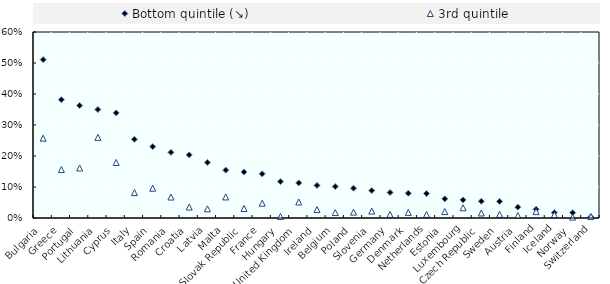
| Category | Bottom quintile (↘) | 3rd quintile |
|---|---|---|
| Bulgaria | 0.511 | 0.258 |
| Greece | 0.382 | 0.156 |
| Portugal | 0.363 | 0.161 |
| Lithuania | 0.35 | 0.26 |
| Cyprus | 0.339 | 0.179 |
| Italy | 0.254 | 0.082 |
| Spain | 0.23 | 0.096 |
| Romania | 0.212 | 0.068 |
| Croatia | 0.204 | 0.035 |
| Latvia | 0.179 | 0.03 |
| Malta | 0.155 | 0.068 |
| Slovak Republic | 0.148 | 0.031 |
| France | 0.142 | 0.048 |
| Hungary | 0.117 | 0.005 |
| United Kingdom | 0.113 | 0.052 |
| Ireland | 0.105 | 0.027 |
| Belgium | 0.102 | 0.018 |
| Poland | 0.096 | 0.019 |
| Slovenia | 0.089 | 0.022 |
| Germany | 0.082 | 0.012 |
| Denmark | 0.08 | 0.018 |
| Netherlands | 0.079 | 0.012 |
| Estonia | 0.062 | 0.021 |
| Luxembourg | 0.059 | 0.033 |
| Czech Republic | 0.054 | 0.016 |
| Sweden | 0.054 | 0.012 |
| Austria | 0.035 | 0.008 |
| Finland | 0.028 | 0.021 |
| Iceland | 0.017 | 0.01 |
| Norway | 0.017 | 0.003 |
| Switzerland | 0.004 | 0.005 |